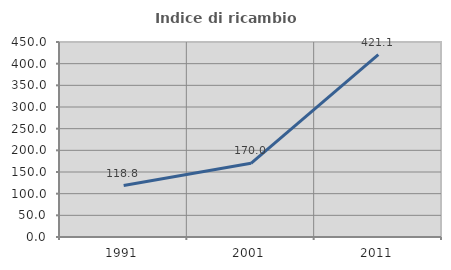
| Category | Indice di ricambio occupazionale  |
|---|---|
| 1991.0 | 118.75 |
| 2001.0 | 170 |
| 2011.0 | 421.053 |